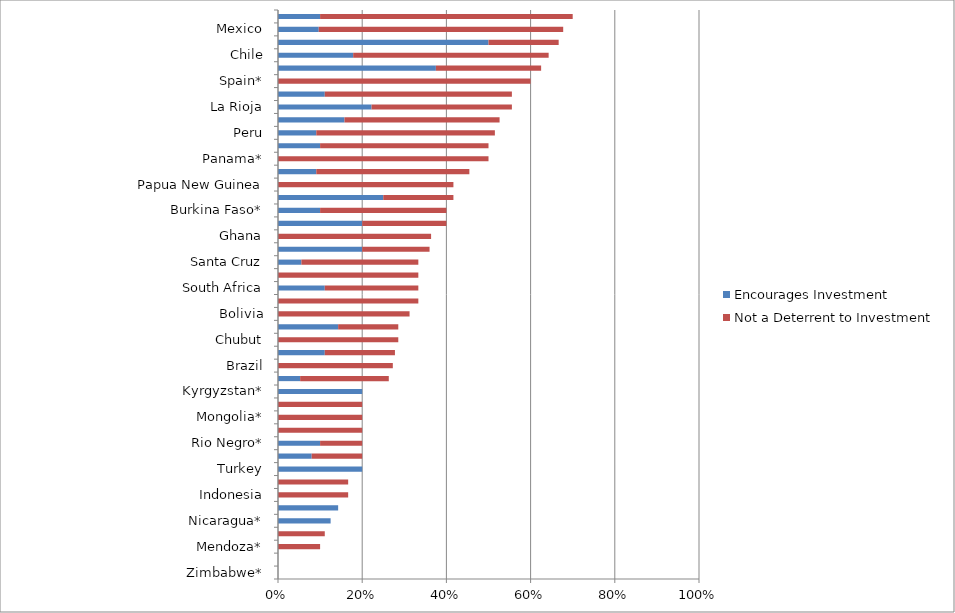
| Category | Encourages Investment | Not a Deterrent to Investment |
|---|---|---|
| Zimbabwe* | 0 | 0 |
| Democratic Republic of Congo (DRC)* | 0 | 0 |
| Mendoza* | 0 | 0.1 |
| Venezuela* | 0 | 0.111 |
| Nicaragua* | 0.125 | 0 |
| Russia* | 0.143 | 0 |
| Indonesia | 0 | 0.167 |
| Guyana* | 0 | 0.167 |
| Turkey | 0.2 | 0 |
| Salta | 0.08 | 0.12 |
| Rio Negro* | 0.1 | 0.1 |
| Philippines* | 0 | 0.2 |
| Mongolia* | 0 | 0.2 |
| Liberia* | 0 | 0.2 |
| Kyrgyzstan* | 0.2 | 0 |
| Jujuy | 0.053 | 0.211 |
| Brazil | 0 | 0.273 |
| Catamarca | 0.111 | 0.167 |
| Chubut | 0 | 0.286 |
| China* | 0.143 | 0.143 |
| Bolivia | 0 | 0.312 |
| Tanzania* | 0 | 0.333 |
| South Africa | 0.111 | 0.222 |
| Greenland* | 0 | 0.333 |
| Santa Cruz | 0.056 | 0.278 |
| San Juan | 0.2 | 0.16 |
| Ghana | 0 | 0.364 |
| New Zealand* | 0.2 | 0.2 |
| Burkina Faso* | 0.1 | 0.3 |
| Kazakhstan | 0.25 | 0.167 |
| Papua New Guinea | 0 | 0.417 |
| Ecuador | 0.091 | 0.364 |
| Panama* | 0 | 0.5 |
| Mali* | 0.1 | 0.4 |
| Peru | 0.091 | 0.424 |
| Namibia | 0.158 | 0.368 |
| La Rioja | 0.222 | 0.333 |
| Guinea (Conakry) | 0.111 | 0.444 |
| Spain* | 0 | 0.6 |
| Northern Ireland* | 0.375 | 0.25 |
| Chile | 0.179 | 0.464 |
| Niger* | 0.5 | 0.167 |
| Mexico | 0.097 | 0.581 |
| Norway | 0.1 | 0.6 |